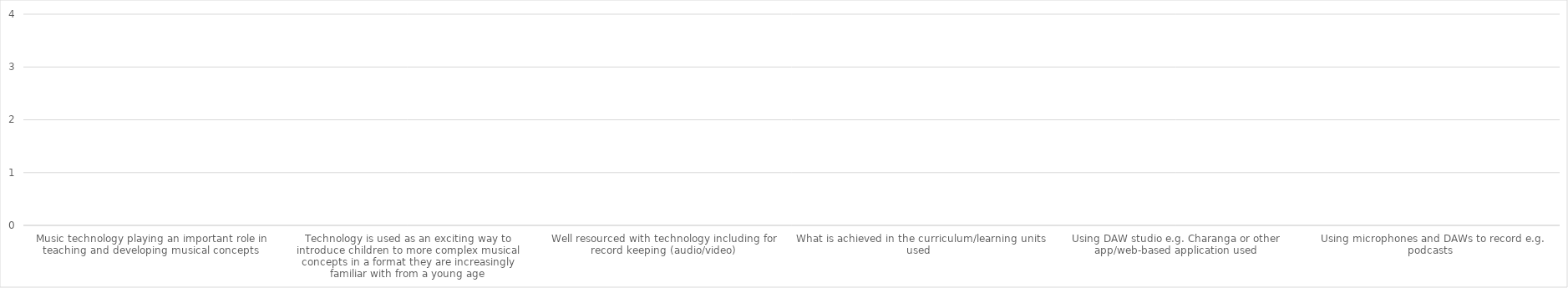
| Category | Series 0 |
|---|---|
| Music technology playing an important role in teaching and developing musical concepts  | 0 |
| Technology is used as an exciting way to introduce children to more complex musical concepts in a format they are increasingly familiar with from a young age | 0 |
| Well resourced with technology including for record keeping (audio/video) | 0 |
| What is achieved in the curriculum/learning units used  | 0 |
| Using DAW studio e.g. Charanga or other app/web-based application used | 0 |
| Using microphones and DAWs to record e.g. podcasts  | 0 |